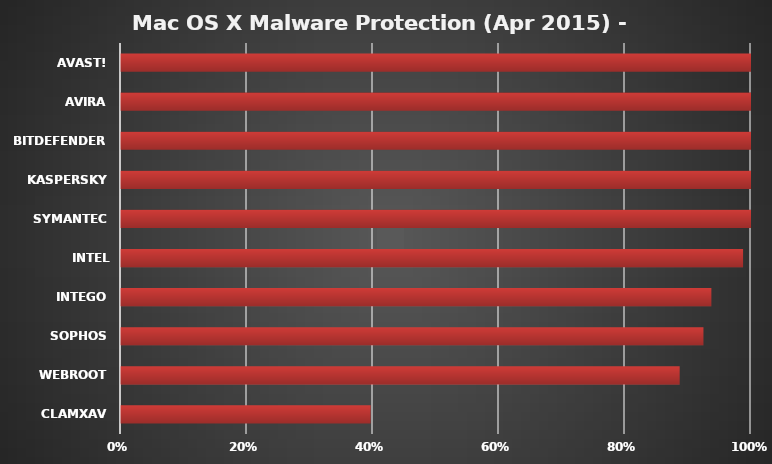
| Category | Series 0 |
|---|---|
| ClamXav | 0.396 |
| Webroot | 0.887 |
| Sophos | 0.925 |
| Intego | 0.937 |
| Intel Security | 0.987 |
| Symantec | 1 |
| Kaspersky | 1 |
| Bitdefender | 1 |
| Avira | 1 |
| avast! | 1 |